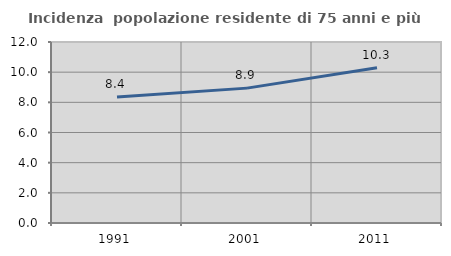
| Category | Incidenza  popolazione residente di 75 anni e più |
|---|---|
| 1991.0 | 8.351 |
| 2001.0 | 8.942 |
| 2011.0 | 10.294 |